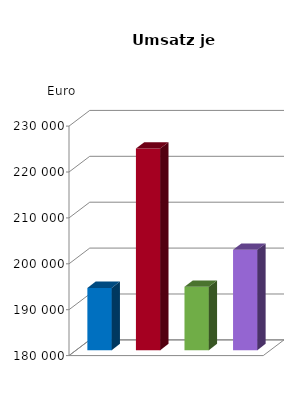
| Category | Umsatz je Beschäftigten |
|---|---|
| Vorl.güter/Energie | 193561.9 |
| Investitionsgüterproduzenten | 223930.751 |
| Gebrauchsgüterproduzenten | 193825.572 |
| Verbrauchsgüterproduzenten | 201892.723 |